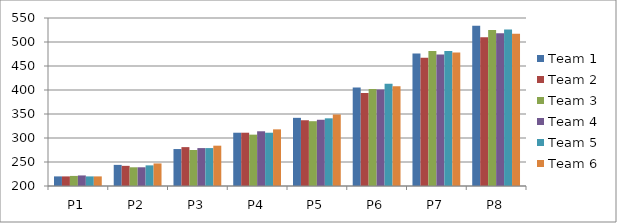
| Category | Team 1 | Team 2 | Team 3 | Team 4 | Team 5 | Team 6 |
|---|---|---|---|---|---|---|
| P1 | 220 | 220 | 221 | 222 | 220 | 220 |
| P2 | 244 | 242 | 239 | 239 | 243 | 247 |
| P3 | 277 | 281 | 275 | 279 | 279 | 284 |
| P4 | 311 | 311 | 307 | 314 | 311 | 318 |
| P5 | 342 | 337 | 335 | 338 | 341 | 349 |
| P6 | 405 | 394 | 402 | 401 | 413 | 408 |
| P7 | 476 | 467 | 481 | 474 | 481 | 478 |
| P8 | 534 | 510 | 525 | 518 | 526 | 517 |